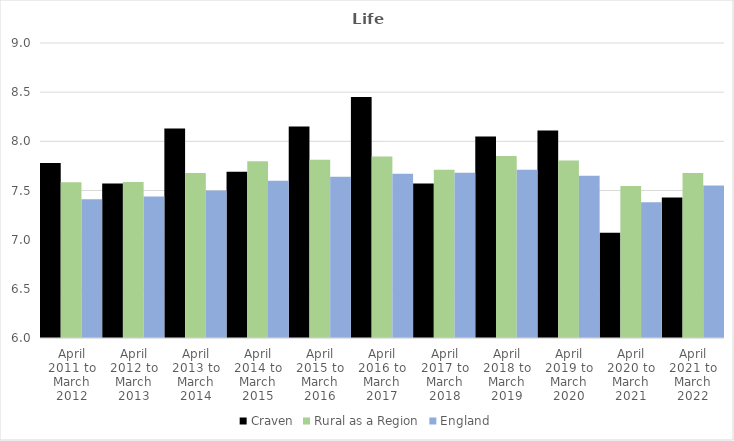
| Category | Craven | Rural as a Region | England |
|---|---|---|---|
| April 2011 to March 2012 | 7.78 | 7.584 | 7.41 |
| April 2012 to March 2013 | 7.57 | 7.586 | 7.44 |
| April 2013 to March 2014 | 8.13 | 7.677 | 7.5 |
| April 2014 to March 2015 | 7.69 | 7.797 | 7.6 |
| April 2015 to March 2016 | 8.15 | 7.813 | 7.64 |
| April 2016 to March 2017 | 8.45 | 7.845 | 7.67 |
| April 2017 to March 2018 | 7.57 | 7.71 | 7.68 |
| April 2018 to March 2019 | 8.05 | 7.852 | 7.71 |
| April 2019 to March 2020 | 8.11 | 7.806 | 7.65 |
| April 2020 to March 2021 | 7.07 | 7.546 | 7.38 |
| April 2021 to March 2022 | 7.43 | 7.677 | 7.55 |